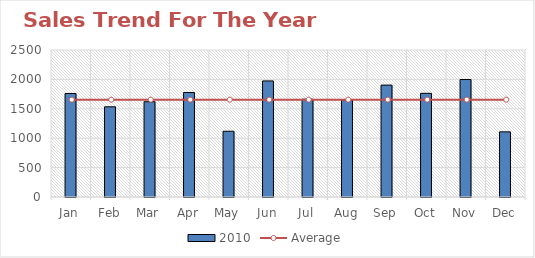
| Category | 2010 |
|---|---|
| Jan | 1760 |
| Feb | 1534 |
| Mar | 1620 |
| Apr | 1777 |
| May | 1118 |
| Jun | 1974 |
| Jul | 1663 |
| Aug | 1650 |
| Sep | 1903 |
| Oct | 1763 |
| Nov | 1998 |
| Dec | 1108 |